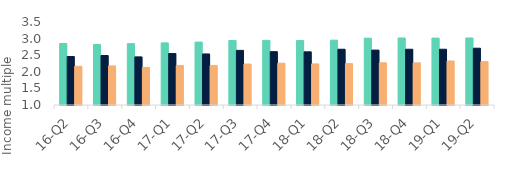
| Category | First-time
buyers | Homemovers | Homowner remortgaging |
|---|---|---|---|
| 16-Q2 | 2.853 | 2.461 | 2.167 |
| 16-Q3 | 2.823 | 2.491 | 2.177 |
| 16-Q4 | 2.848 | 2.449 | 2.132 |
| 17-Q1 | 2.871 | 2.551 | 2.191 |
| 17-Q2 | 2.895 | 2.537 | 2.189 |
| 17-Q3 | 2.942 | 2.645 | 2.234 |
| 17-Q4 | 2.947 | 2.607 | 2.258 |
| 18-Q1 | 2.943 | 2.602 | 2.238 |
| 18-Q2 | 2.953 | 2.68 | 2.247 |
| 18-Q3 | 3.013 | 2.654 | 2.271 |
| 18-Q4 | 3.019 | 2.679 | 2.271 |
| 19-Q1 | 3.016 | 2.68 | 2.325 |
| 19-Q2 | 3.019 | 2.71 | 2.307 |